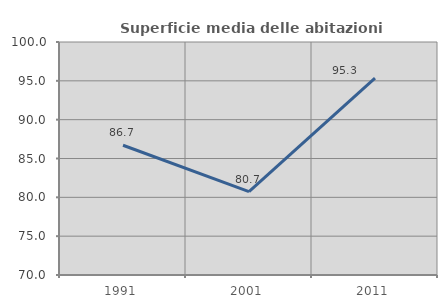
| Category | Superficie media delle abitazioni occupate |
|---|---|
| 1991.0 | 86.709 |
| 2001.0 | 80.724 |
| 2011.0 | 95.341 |